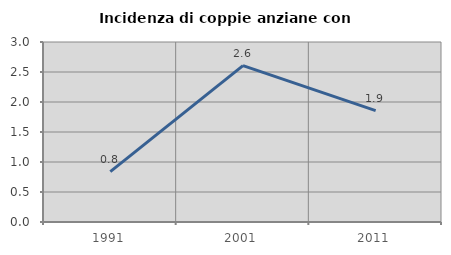
| Category | Incidenza di coppie anziane con figli |
|---|---|
| 1991.0 | 0.84 |
| 2001.0 | 2.606 |
| 2011.0 | 1.857 |